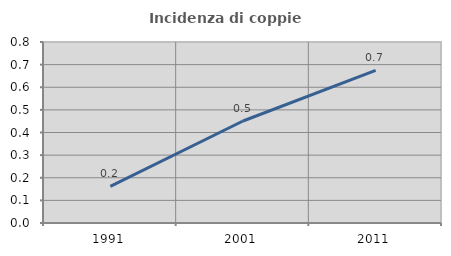
| Category | Incidenza di coppie miste |
|---|---|
| 1991.0 | 0.162 |
| 2001.0 | 0.451 |
| 2011.0 | 0.674 |